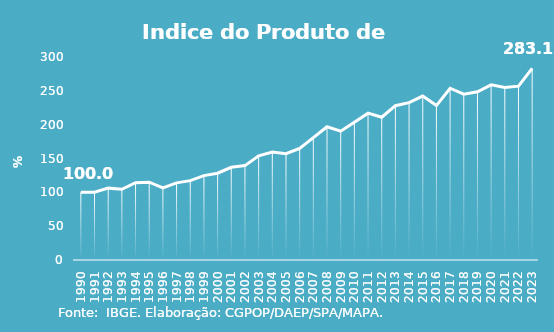
| Category | Indice de Prod. base 1990 |
|---|---|
| 1990.0 | 100 |
| 1991.0 | 100.275 |
| 1992.0 | 106.203 |
| 1993.0 | 104.57 |
| 1994.0 | 114.164 |
| 1995.0 | 115.024 |
| 1996.0 | 106.552 |
| 1997.0 | 114.037 |
| 1998.0 | 117.319 |
| 1999.0 | 124.734 |
| 2000.0 | 128.293 |
| 2001.0 | 136.975 |
| 2002.0 | 139.51 |
| 2003.0 | 153.868 |
| 2004.0 | 159.641 |
| 2005.0 | 157.136 |
| 2006.0 | 164.858 |
| 2007.0 | 180.781 |
| 2008.0 | 196.91 |
| 2009.0 | 190.309 |
| 2010.0 | 203.581 |
| 2011.0 | 217.041 |
| 2012.0 | 210.932 |
| 2013.0 | 228.009 |
| 2014.0 | 232.562 |
| 2015.0 | 242.318 |
| 2016.0 | 228.239 |
| 2017.0 | 253.826 |
| 2018.0 | 245.134 |
| 2019.0 | 248.619 |
| 2020.0 | 258.848 |
| 2021.0 | 254.988 |
| 2022.0 | 256.903 |
| 2023.0 | 283.116 |